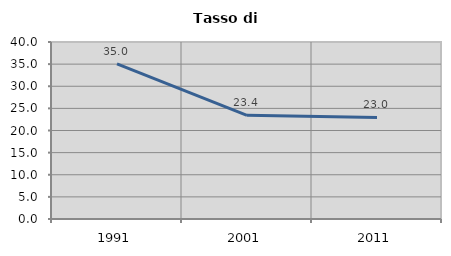
| Category | Tasso di disoccupazione   |
|---|---|
| 1991.0 | 35.047 |
| 2001.0 | 23.424 |
| 2011.0 | 22.959 |